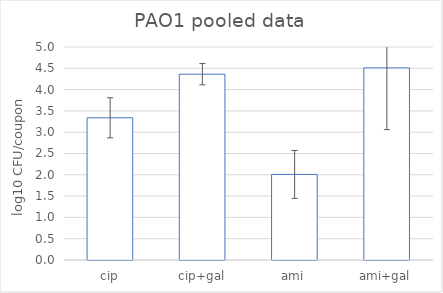
| Category | Series 0 |
|---|---|
| cip | 3.338 |
| cip+gal | 4.362 |
| ami | 2.009 |
| ami+gal | 4.509 |